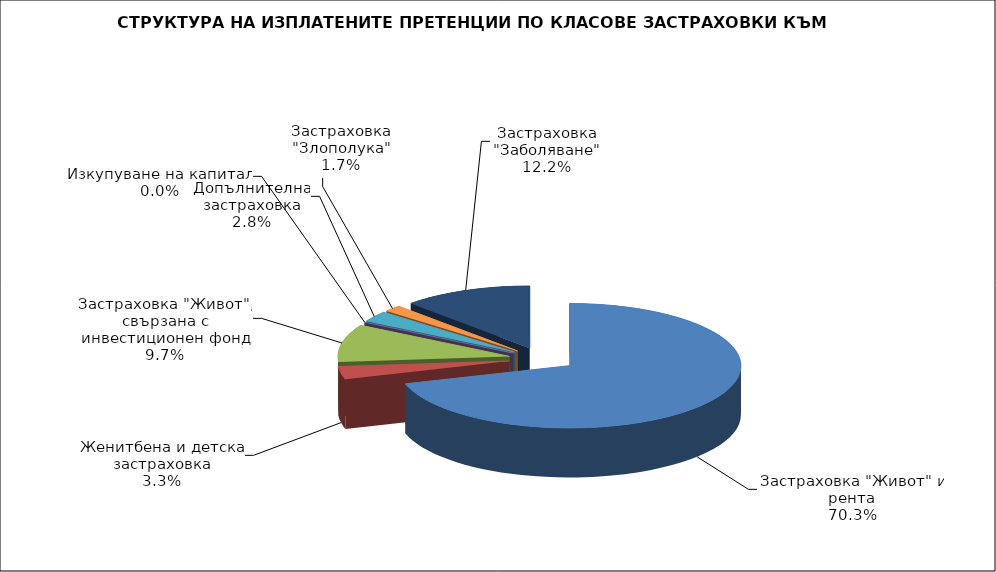
| Category | 64 147 875 |
|---|---|
| Застраховка "Живот" и рента | 64147875.109 |
| Женитбена и детска застраховка | 3007872.99 |
| Застраховка "Живот", свързана с инвестиционен фонд | 8880886.145 |
| Изкупуване на капитал | 0 |
| Допълнителна застраховка | 2574535.433 |
| Застраховка "Злополука" | 1523304.93 |
| Застраховка "Заболяване" | 11134513.96 |